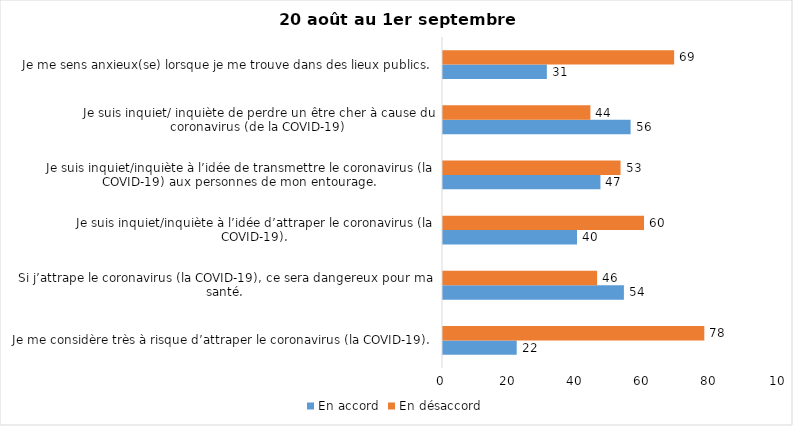
| Category | En accord | En désaccord |
|---|---|---|
| Je me considère très à risque d’attraper le coronavirus (la COVID-19). | 22 | 78 |
| Si j’attrape le coronavirus (la COVID-19), ce sera dangereux pour ma santé. | 54 | 46 |
| Je suis inquiet/inquiète à l’idée d’attraper le coronavirus (la COVID-19). | 40 | 60 |
| Je suis inquiet/inquiète à l’idée de transmettre le coronavirus (la COVID-19) aux personnes de mon entourage. | 47 | 53 |
| Je suis inquiet/ inquiète de perdre un être cher à cause du coronavirus (de la COVID-19) | 56 | 44 |
| Je me sens anxieux(se) lorsque je me trouve dans des lieux publics. | 31 | 69 |